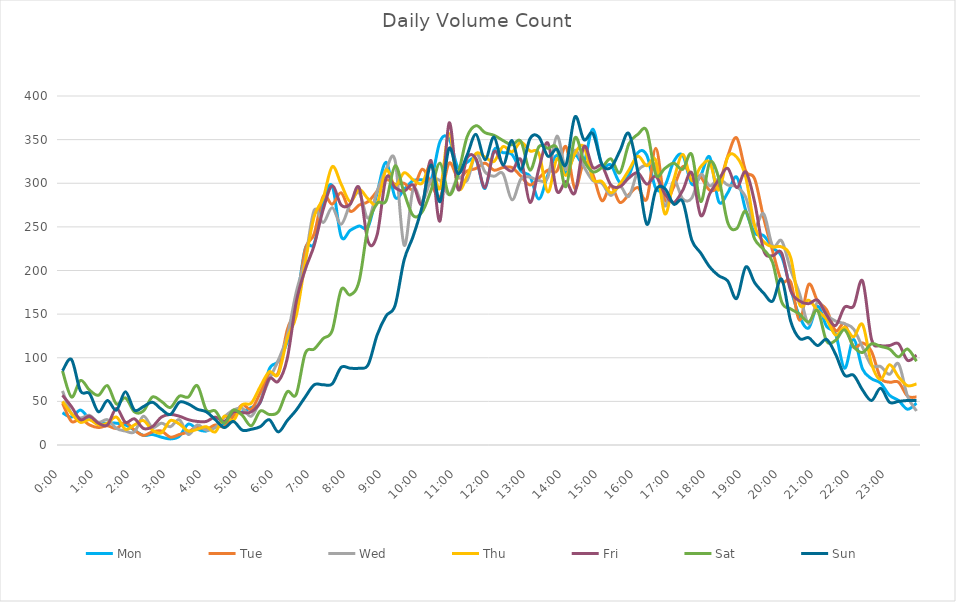
| Category | Mon | Tue | Wed | Thu | Fri | Sat | Sun |
|---|---|---|---|---|---|---|---|
| 0.0 | 37 | 48 | 62 | 50 | 57 | 85 | 85 |
| 0.010416666666666666 | 32 | 27 | 36 | 36 | 44 | 55 | 98 |
| 0.020833333333333332 | 40 | 30 | 31 | 26 | 29 | 74 | 62 |
| 0.03125 | 30 | 23 | 34 | 29 | 33 | 63 | 59 |
| 0.041666666666666664 | 25 | 20 | 26 | 23 | 25 | 57 | 38 |
| 0.05208333333333333 | 25 | 22 | 29 | 25 | 23 | 68 | 51 |
| 0.06249999999999999 | 25 | 19 | 19 | 32 | 42 | 47 | 40 |
| 0.07291666666666666 | 23 | 26 | 16 | 18 | 26 | 54 | 61 |
| 0.08333333333333333 | 17 | 17 | 15 | 23 | 30 | 38 | 40 |
| 0.09375 | 11 | 11 | 33 | 28 | 19 | 39 | 44 |
| 0.10416666666666667 | 12 | 15 | 20 | 17 | 21 | 55 | 49 |
| 0.11458333333333334 | 9 | 16 | 25 | 14 | 32 | 50 | 41 |
| 0.125 | 7 | 9 | 21 | 28 | 35 | 43 | 35 |
| 0.13541666666666666 | 10 | 12 | 29 | 24 | 33 | 56 | 49 |
| 0.14583333333333331 | 24 | 15 | 12 | 16 | 29 | 55 | 47 |
| 0.15624999999999997 | 18 | 21 | 23 | 18 | 27 | 68 | 41 |
| 0.16666666666666663 | 16 | 18 | 17 | 21 | 27 | 40 | 38 |
| 0.1770833333333333 | 22 | 23 | 20 | 15 | 32 | 39 | 29 |
| 0.18749999999999994 | 25 | 21 | 32 | 33 | 27 | 25 | 20 |
| 0.1979166666666666 | 36 | 33 | 40 | 28 | 38 | 40 | 27 |
| 0.20833333333333326 | 38 | 46 | 42 | 46 | 37 | 34 | 17 |
| 0.21874999999999992 | 43 | 41 | 33 | 48 | 38 | 22 | 18 |
| 0.22916666666666657 | 49 | 60 | 51 | 67 | 49 | 39 | 21 |
| 0.23958333333333323 | 87 | 82 | 75 | 84 | 76 | 35 | 29 |
| 0.2499999999999999 | 96 | 83 | 97 | 81 | 73 | 38 | 15 |
| 0.2604166666666666 | 118 | 132 | 125 | 122 | 99 | 61 | 28 |
| 0.27083333333333326 | 161 | 159 | 175 | 148 | 164 | 58 | 40 |
| 0.28124999999999994 | 225 | 224 | 213 | 209 | 201 | 105 | 55 |
| 0.29166666666666663 | 231 | 242 | 269 | 262 | 229 | 110 | 69 |
| 0.3020833333333333 | 278 | 285 | 255 | 283 | 270 | 122 | 69 |
| 0.3125 | 297 | 276 | 272 | 319 | 297 | 131 | 70 |
| 0.3229166666666667 | 239 | 289 | 253 | 299 | 275 | 178 | 89 |
| 0.33333333333333337 | 246 | 268 | 276 | 279 | 276 | 172 | 88 |
| 0.34375000000000006 | 251 | 275 | 289 | 293 | 295 | 188 | 88 |
| 0.35416666666666674 | 250 | 279 | 260 | 282 | 233 | 251 | 92 |
| 0.3645833333333334 | 289 | 291 | 291 | 277 | 241 | 277 | 126 |
| 0.3750000000000001 | 324 | 304 | 316 | 315 | 306 | 280 | 148 |
| 0.3854166666666668 | 284 | 299 | 326 | 297 | 295 | 320 | 160 |
| 0.3958333333333335 | 293 | 300 | 229 | 312 | 291 | 289 | 212 |
| 0.40625000000000017 | 303 | 293 | 293 | 304 | 298 | 263 | 239 |
| 0.41666666666666685 | 304 | 316 | 279 | 300 | 276 | 267 | 273 |
| 0.4270833333333333 | 304 | 300 | 303 | 322 | 326 | 292 | 321 |
| 0.4375000000000002 | 348 | 284 | 303 | 294 | 257 | 323 | 279 |
| 0.4479166666666669 | 351 | 323 | 287 | 357 | 369 | 287 | 340 |
| 0.4583333333333333 | 318 | 306 | 307 | 295 | 293 | 310 | 311 |
| 0.4687500000000003 | 324 | 314 | 303 | 308 | 329 | 353 | 332 |
| 0.47916666666666696 | 327 | 317 | 334 | 334 | 328 | 366 | 356 |
| 0.4895833333333333 | 294 | 323 | 313 | 330 | 295 | 358 | 327 |
| 0.5000000000000003 | 338 | 315 | 308 | 325 | 336 | 355 | 353 |
| 0.510416666666667 | 335 | 318 | 311 | 342 | 321 | 349 | 321 |
| 0.5208333333333334 | 333 | 318 | 281 | 336 | 314 | 344 | 349 |
| 0.5312500000000002 | 314 | 308 | 305 | 347 | 327 | 348 | 316 |
| 0.5416666666666669 | 308 | 298 | 307 | 337 | 278 | 315 | 351 |
| 0.5520833333333335 | 282 | 306 | 303 | 334 | 317 | 342 | 353 |
| 0.5625000000000001 | 310 | 315 | 307 | 290 | 346 | 340 | 331 |
| 0.5729166666666667 | 332 | 314 | 354 | 328 | 291 | 340 | 339 |
| 0.5833333333333334 | 312 | 342 | 316 | 309 | 302 | 296 | 321 |
| 0.59375 | 332 | 294 | 338 | 334 | 289 | 352 | 376 |
| 0.6041666666666666 | 324 | 324 | 319 | 342 | 342 | 326 | 350 |
| 0.6145833333333333 | 362 | 310 | 303 | 305 | 318 | 313 | 357 |
| 0.6249999999999999 | 321 | 280 | 300 | 302 | 320 | 318 | 322 |
| 0.6354166666666665 | 321 | 297 | 286 | 289 | 298 | 328 | 318 |
| 0.6458333333333331 | 301 | 278 | 297 | 299 | 296 | 312 | 337 |
| 0.6562499999999998 | 309 | 287 | 285 | 315 | 306 | 345 | 357 |
| 0.6666666666666666 | 335 | 295 | 314 | 331 | 312 | 356 | 313 |
| 0.677083333333333 | 332 | 282 | 321 | 320 | 299 | 360 | 253 |
| 0.6874999999999997 | 294 | 340 | 319 | 326 | 308 | 310 | 292 |
| 0.6979166666666666 | 297 | 281 | 274 | 265 | 288 | 317 | 294 |
| 0.7083333333333329 | 325 | 296 | 303 | 304 | 278 | 323 | 276 |
| 0.7187499999999996 | 332 | 319 | 282 | 333 | 292 | 316 | 279 |
| 0.7291666666666666 | 299 | 310 | 283 | 303 | 312 | 333 | 235 |
| 0.7395833333333328 | 309 | 307 | 310 | 319 | 263 | 279 | 220 |
| 0.75 | 330 | 292 | 297 | 324 | 288 | 324 | 204 |
| 0.7604166666666666 | 279 | 298 | 305 | 292 | 304 | 306 | 194 |
| 0.7708333333333327 | 289 | 331 | 298 | 330 | 317 | 255 | 188 |
| 0.78125 | 307 | 352 | 296 | 330 | 295 | 248 | 168 |
| 0.7916666666666666 | 269 | 314 | 284 | 307 | 313 | 268 | 204 |
| 0.8020833333333326 | 243 | 305 | 251 | 251 | 278 | 236 | 186 |
| 0.8125 | 240 | 260 | 265 | 233 | 223 | 224 | 174 |
| 0.8229166666666666 | 226 | 222 | 228 | 227 | 217 | 209 | 165 |
| 0.8333333333333334 | 216 | 188 | 234 | 227 | 220 | 164 | 190 |
| 0.84375 | 179 | 187 | 201 | 215 | 177 | 156 | 142 |
| 0.8541666666666666 | 147 | 143 | 173 | 161 | 165 | 150 | 122 |
| 0.8645833333333334 | 134 | 184 | 139 | 166 | 162 | 141 | 123 |
| 0.875 | 159 | 165 | 164 | 154 | 166 | 154 | 114 |
| 0.8854166666666666 | 136 | 155 | 149 | 144 | 149 | 119 | 121 |
| 0.8958333333333334 | 127 | 131 | 142 | 126 | 137 | 120 | 104 |
| 0.90625 | 88 | 139 | 139 | 135 | 158 | 132 | 80 |
| 0.9166666666666666 | 121 | 112 | 133 | 124 | 159 | 113 | 80 |
| 0.9270833333333334 | 87 | 117 | 112 | 138 | 188 | 106 | 63 |
| 0.9375 | 76 | 107 | 91 | 93 | 121 | 116 | 51 |
| 0.9479166666666666 | 71 | 77 | 90 | 75 | 114 | 113 | 65 |
| 0.9583333333333334 | 57 | 72 | 81 | 92 | 114 | 110 | 49 |
| 0.96875 | 51 | 72 | 93 | 78 | 116 | 101 | 50 |
| 0.9791666666666666 | 41 | 56 | 56 | 68 | 97 | 110 | 51 |
| 0.9895833333333334 | 48 | 55 | 39 | 70 | 103 | 96 | 51 |